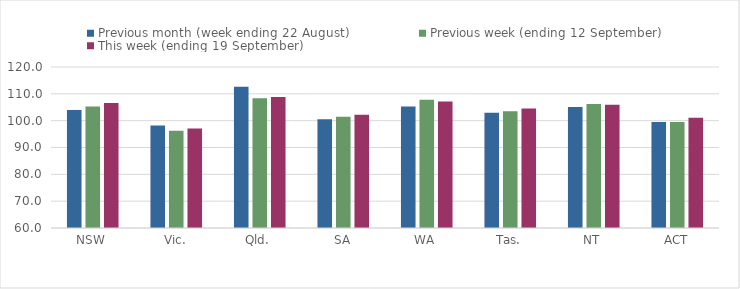
| Category | Previous month (week ending 22 August) | Previous week (ending 12 September) | This week (ending 19 September) |
|---|---|---|---|
| NSW | 103.99 | 105.27 | 106.59 |
| Vic. | 98.17 | 96.22 | 97.09 |
| Qld. | 112.61 | 108.35 | 108.85 |
| SA | 100.52 | 101.43 | 102.23 |
| WA | 105.25 | 107.82 | 107.18 |
| Tas. | 102.98 | 103.5 | 104.52 |
| NT | 105.13 | 106.2 | 105.94 |
| ACT | 99.46 | 99.53 | 101.06 |